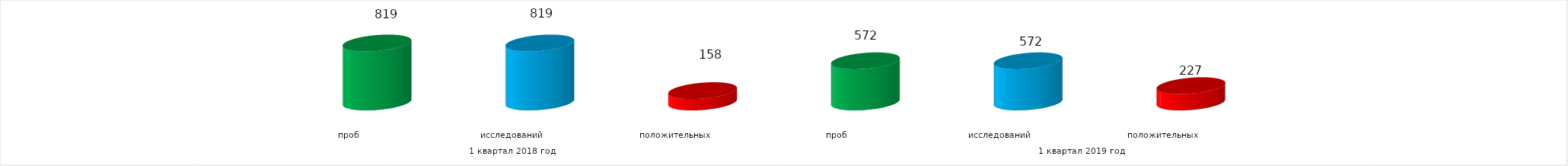
| Category | Series 4 |
|---|---|
| 0 | 819 |
| 1 | 819 |
| 2 | 158 |
| 3 | 572 |
| 4 | 572 |
| 5 | 227 |